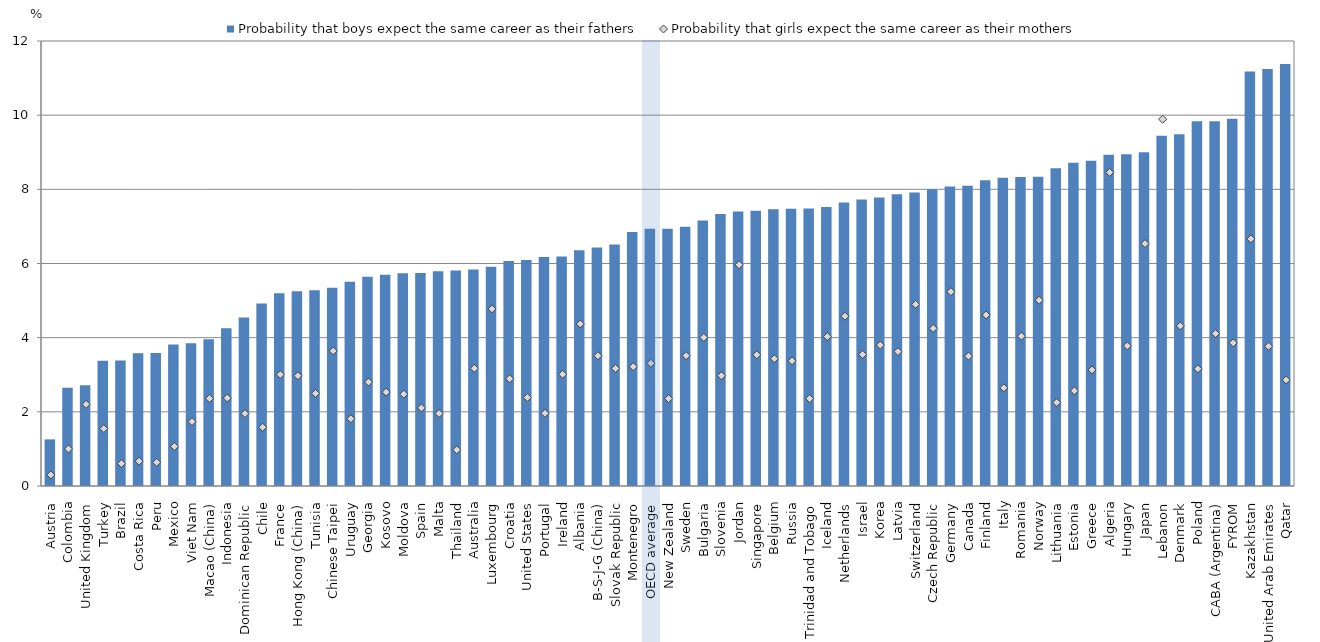
| Category | Probability that boys expect the same career as their fathers |
|---|---|
| Austria | 1.257 |
| Colombia | 2.652 |
| United Kingdom | 2.717 |
| Turkey | 3.378 |
| Brazil | 3.383 |
| Costa Rica | 3.578 |
| Peru | 3.587 |
| Mexico | 3.819 |
| Viet Nam | 3.851 |
| Macao (China) | 3.958 |
| Indonesia | 4.251 |
| Dominican Republic | 4.54 |
| Chile | 4.924 |
| France | 5.198 |
| Hong Kong (China) | 5.249 |
| Tunisia | 5.28 |
| Chinese Taipei | 5.344 |
| Uruguay | 5.511 |
| Georgia | 5.644 |
| Kosovo | 5.699 |
| Moldova | 5.739 |
| Spain | 5.743 |
| Malta | 5.791 |
| Thailand | 5.812 |
| Australia | 5.839 |
| Luxembourg | 5.915 |
| Croatia | 6.067 |
| United States | 6.091 |
| Portugal | 6.174 |
| Ireland | 6.191 |
| Albania | 6.356 |
| B-S-J-G (China) | 6.43 |
| Slovak Republic | 6.51 |
| Montenegro | 6.848 |
| OECD average | 6.936 |
| New Zealand | 6.939 |
| Sweden | 6.991 |
| Bulgaria | 7.156 |
| Slovenia | 7.334 |
| Jordan | 7.404 |
| Singapore | 7.423 |
| Belgium | 7.462 |
| Russia | 7.477 |
| Trinidad and Tobago | 7.484 |
| Iceland | 7.522 |
| Netherlands | 7.648 |
| Israel | 7.724 |
| Korea | 7.777 |
| Latvia | 7.867 |
| Switzerland | 7.916 |
| Czech Republic | 8.004 |
| Germany | 8.073 |
| Canada | 8.096 |
| Finland | 8.245 |
| Italy | 8.313 |
| Romania | 8.334 |
| Norway | 8.342 |
| Lithuania | 8.566 |
| Estonia | 8.719 |
| Greece | 8.768 |
| Algeria | 8.931 |
| Hungary | 8.949 |
| Japan | 9.001 |
| Lebanon | 9.447 |
| Denmark | 9.487 |
| Poland | 9.834 |
| CABA (Argentina) | 9.835 |
| FYROM | 9.904 |
| Kazakhstan | 11.179 |
| United Arab Emirates | 11.242 |
| Qatar | 11.379 |